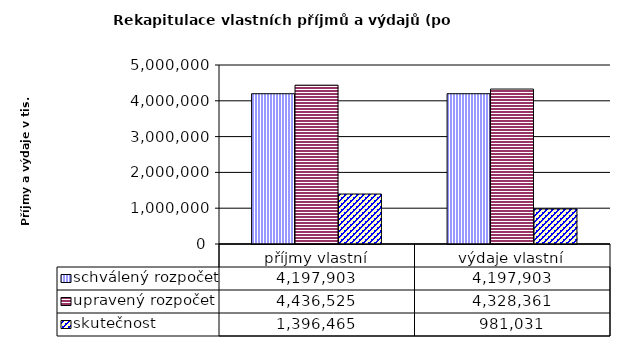
| Category | schválený rozpočet | upravený rozpočet | skutečnost |
|---|---|---|---|
| příjmy vlastní | 4197903 | 4436525 | 1396465 |
| výdaje vlastní | 4197903 | 4328361 | 981031 |